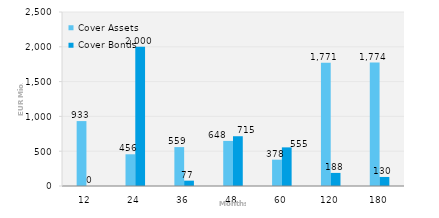
| Category | Cover Assets | Cover Bonds |
|---|---|---|
| 12.0 | 932.731 | 0 |
| 24.0 | 455.698 | 2000 |
| 36.0 | 559.04 | 76.656 |
| 48.0 | 647.652 | 715 |
| 60.0 | 377.974 | 555 |
| 120.0 | 1771.434 | 188 |
| 180.0 | 1773.555 | 130 |